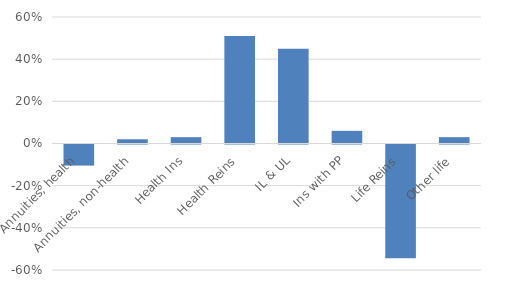
| Category | Series 0 |
|---|---|
| Annuities, health | -0.1 |
| Annuities, non-health | 0.02 |
| Health Ins | 0.03 |
| Health Reins | 0.51 |
| IL & UL | 0.45 |
| Ins with PP | 0.06 |
| Life Reins | -0.54 |
| Other life | 0.03 |